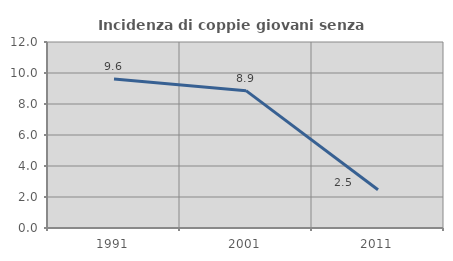
| Category | Incidenza di coppie giovani senza figli |
|---|---|
| 1991.0 | 9.615 |
| 2001.0 | 8.861 |
| 2011.0 | 2.469 |